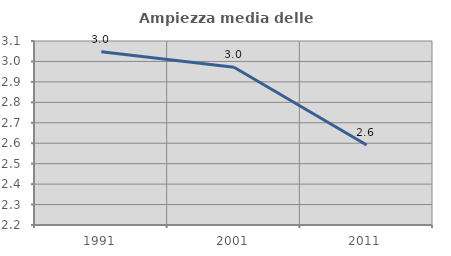
| Category | Ampiezza media delle famiglie |
|---|---|
| 1991.0 | 3.047 |
| 2001.0 | 2.972 |
| 2011.0 | 2.591 |